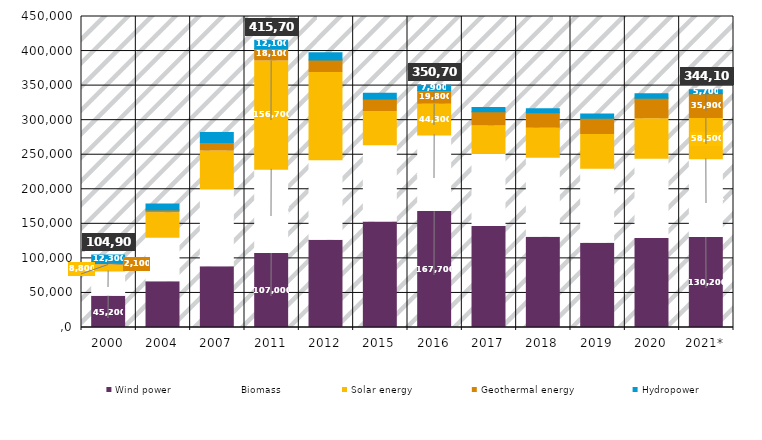
| Category | Wind power | Biomass | Solar energy | Geothermal energy | Hydropower |
|---|---|---|---|---|---|
| 2000 | 45200 | 36500 | 8800 | 2100 | 12300 |
| 2004 | 66200 | 64500 | 35400 | 3800 | 8700 |
| 2007 | 87800 | 112700 | 54800 | 12500 | 14200 |
| 2011 | 107000 | 121800 | 156700 | 18100 | 12100 |
| 2012 | 126400 | 116300 | 126300 | 17900 | 10800 |
| 2015 | 152600 | 112000 | 48000 | 18200 | 8300 |
| 2016 | 167700 | 111000 | 44300 | 19800 | 7900 |
| 2017 | 146200 | 105600 | 39900 | 20500 | 6300 |
| 2018 | 130500 | 115900 | 42000 | 22200 | 5900 |
| 2019 | 122000 | 108400 | 48900 | 23500 | 6200 |
| 2020 | 128800 | 116000 | 57300 | 29700 | 6400 |
| 2021* | 130200 | 113800 | 58500 | 35900 | 5700 |